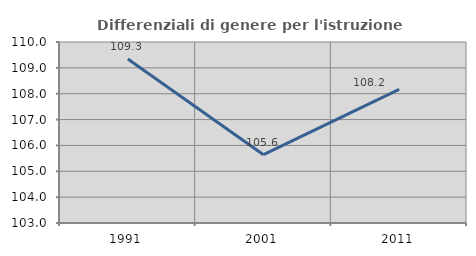
| Category | Differenziali di genere per l'istruzione superiore |
|---|---|
| 1991.0 | 109.341 |
| 2001.0 | 105.642 |
| 2011.0 | 108.169 |